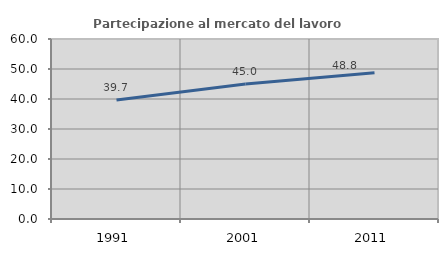
| Category | Partecipazione al mercato del lavoro  femminile |
|---|---|
| 1991.0 | 39.651 |
| 2001.0 | 45.023 |
| 2011.0 | 48.773 |